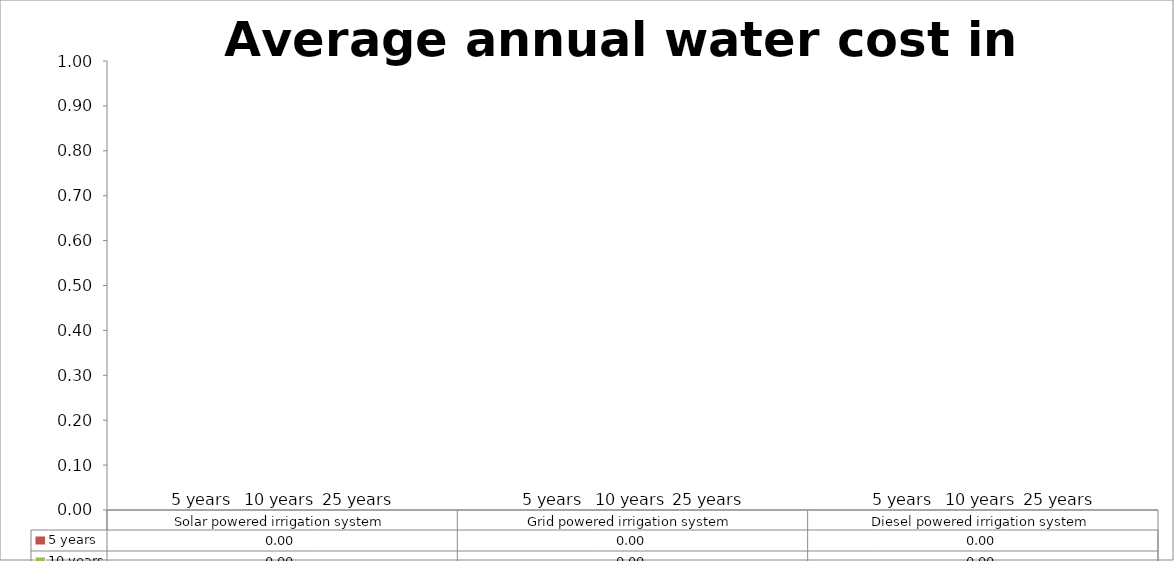
| Category | 5 years | 10 years | 25 years |
|---|---|---|---|
| Solar powered irrigation system | 0 | 0 | 0 |
| Grid powered irrigation system | 0 | 0 | 0 |
| Diesel powered irrigation system | 0 | 0 | 0 |